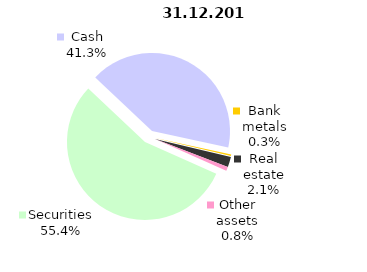
| Category | Total |
|---|---|
| Securities | 887.645 |
| Cash | 662.762 |
| Bank metals | 4.975 |
| Real estate | 34.35 |
| Other assets | 13.421 |